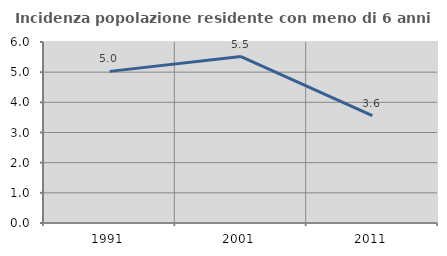
| Category | Incidenza popolazione residente con meno di 6 anni |
|---|---|
| 1991.0 | 5.026 |
| 2001.0 | 5.519 |
| 2011.0 | 3.556 |